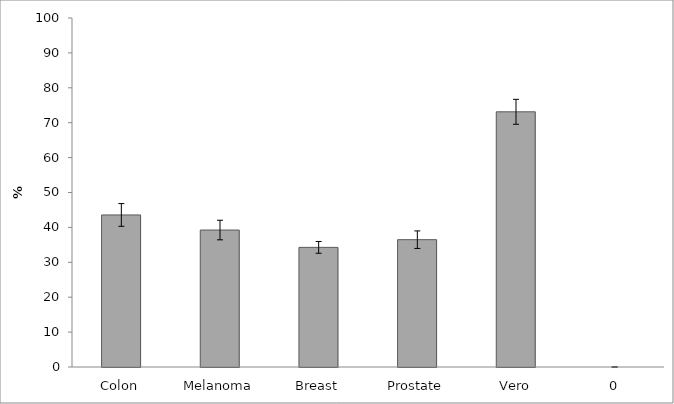
| Category | Series 0 |
|---|---|
| Colon | 43.569 |
| Melanoma | 39.246 |
| Breast | 34.276 |
| Prostate | 36.485 |
| Vero | 73.123 |
| 0 | 0 |